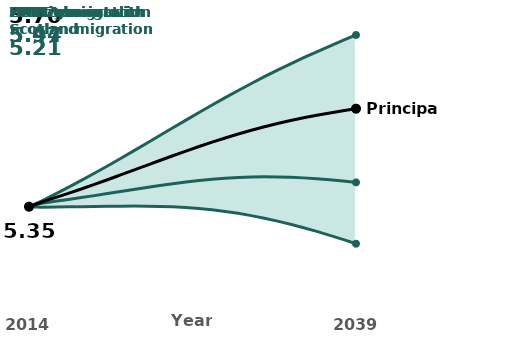
| Category | HM | ZOM |
|---|---|---|
| 0 | 5.348 | 5.348 |
| 1 | 5.369 | 5.345 |
| 2 | 5.393 | 5.347 |
| 3 | 5.418 | 5.347 |
| 4 | 5.442 | 5.348 |
| 5 | 5.468 | 5.349 |
| 6 | 5.495 | 5.349 |
| 7 | 5.522 | 5.35 |
| 8 | 5.549 | 5.35 |
| 9 | 5.577 | 5.35 |
| 10 | 5.605 | 5.349 |
| 11 | 5.632 | 5.347 |
| 12 | 5.66 | 5.345 |
| 13 | 5.688 | 5.341 |
| 14 | 5.715 | 5.336 |
| 15 | 5.741 | 5.331 |
| 16 | 5.767 | 5.324 |
| 17 | 5.793 | 5.315 |
| 18 | 5.817 | 5.306 |
| 19 | 5.841 | 5.296 |
| 20 | 5.864 | 5.284 |
| 21 | 5.886 | 5.272 |
| 22 | 5.907 | 5.258 |
| 23 | 5.928 | 5.244 |
| 24 | 5.948 | 5.229 |
| 25 | 5.968 | 5.214 |